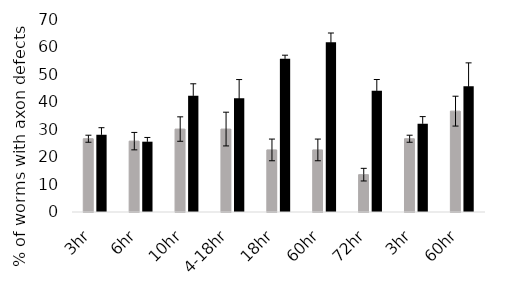
| Category | 1G | 100g |
|---|---|---|
| 3hr | 26.571 | 28.015 |
| 6hr | 25.701 | 25.5 |
| 10hr | 30.079 | 42.124 |
| 4-18hr | 30.079 | 41.3 |
| 18hr | 22.517 | 55.596 |
| 60hr | 22.517 | 61.527 |
| 72hr | 13.545 | 43.948 |
| 3hr | 26.571 | 32.039 |
| 60hr | 36.581 | 45.578 |